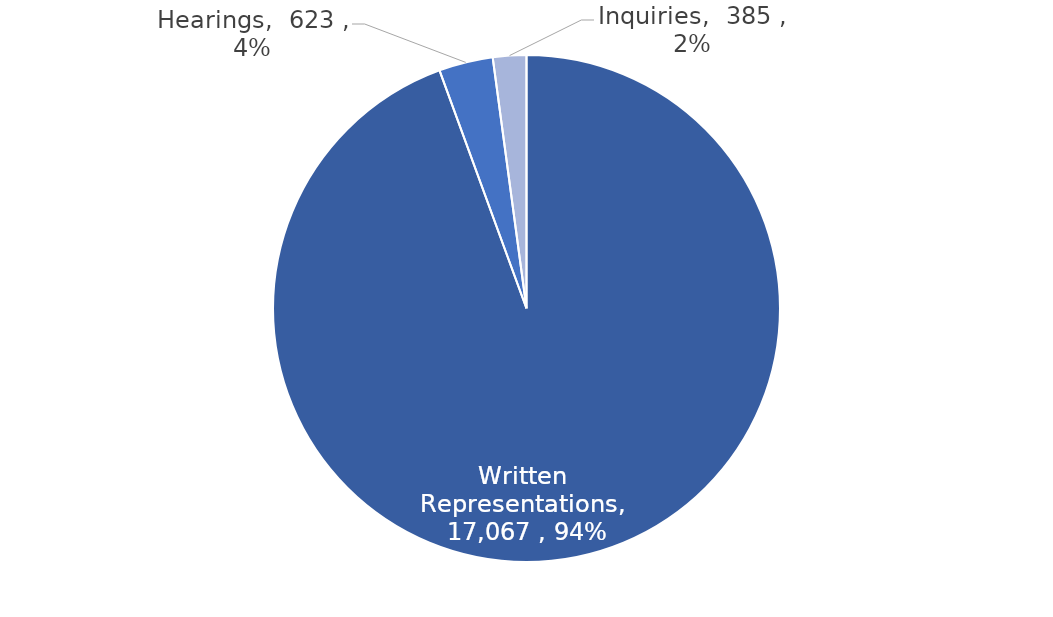
| Category | Series 0 |
|---|---|
| Written Representations | 17067 |
| Hearings | 623 |
| Inquiries | 385 |